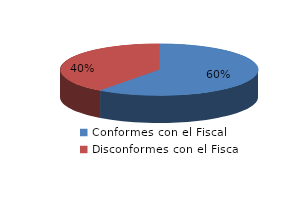
| Category | Series 0 |
|---|---|
| 0 | 12455 |
| 1 | 8275 |